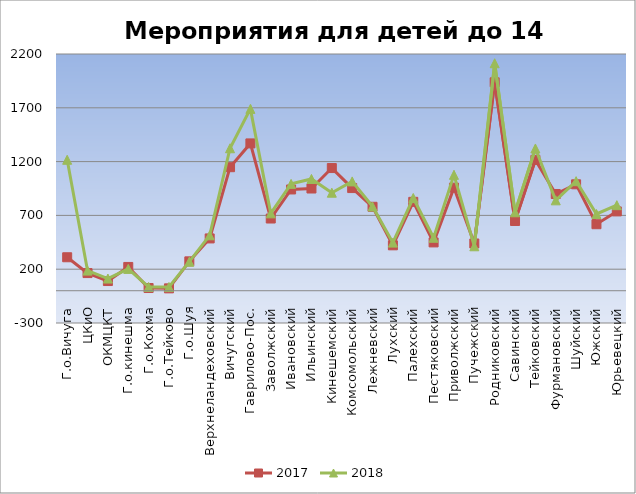
| Category | 2017 | 2018 |
|---|---|---|
| Г.о.Вичуга | 311 | 1217 |
| ЦКиО | 164 | 187 |
| ОКМЦКТ | 90 | 113 |
| Г.о.кинешма | 221 | 203 |
| Г.о.Кохма | 25 | 35 |
| Г.о.Тейково | 22 | 35 |
| Г.о.Шуя | 273 | 270 |
| Верхнеландеховский | 486 | 515 |
| Вичугский | 1148 | 1324 |
| Гаврилово-Пос. | 1369 | 1690 |
| Заволжский | 671 | 719 |
| Ивановский | 941 | 993 |
| Ильинский | 950 | 1039 |
| Кинешемский | 1140 | 911 |
| Комсомольский | 954 | 1016 |
| Лежневский | 780 | 783 |
| Лухский | 422 | 447 |
| Палехский | 826 | 862 |
| Пестяковский | 449 | 492 |
| Приволжский | 958 | 1077 |
| Пучежский | 439 | 413 |
| Родниковский | 1937 | 2114 |
| Савинский | 648 | 729 |
| Тейковский | 1216 | 1322 |
| Фурмановский | 899 | 840 |
| Шуйский | 989 | 1018 |
| Южский | 618 | 713 |
| Юрьевецкий | 737 | 795 |